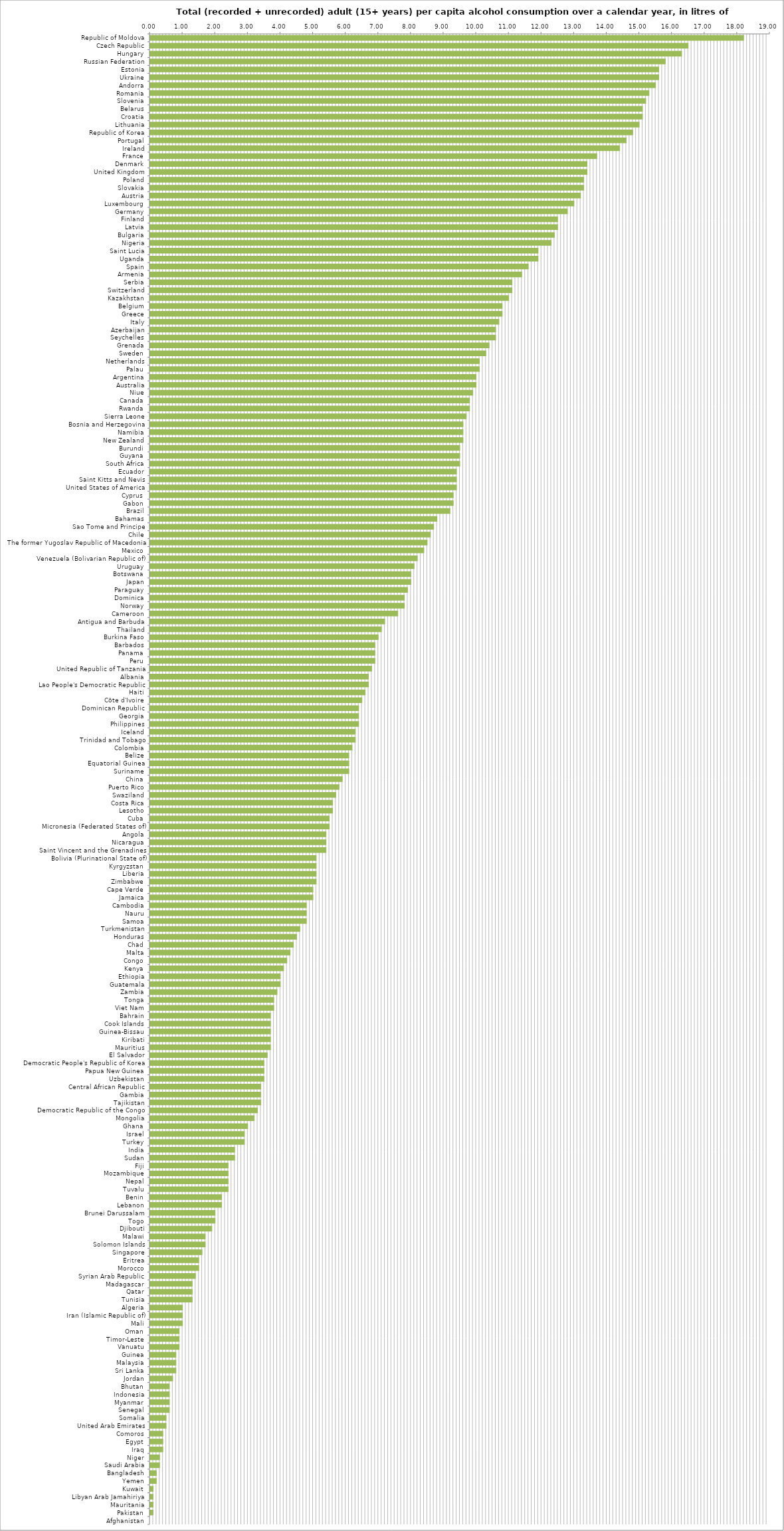
| Category | Series 0 |
|---|---|
| Republic of Moldova | 18.2 |
| Czech Republic | 16.5 |
| Hungary | 16.3 |
| Russian Federation | 15.8 |
| Estonia | 15.6 |
| Ukraine | 15.6 |
| Andorra | 15.5 |
| Romania | 15.3 |
| Slovenia | 15.2 |
| Belarus | 15.1 |
| Croatia | 15.1 |
| Lithuania | 15 |
| Republic of Korea | 14.8 |
| Portugal | 14.6 |
| Ireland | 14.4 |
| France | 13.7 |
| Denmark | 13.4 |
| United Kingdom | 13.4 |
| Poland | 13.3 |
| Slovakia | 13.3 |
| Austria | 13.2 |
| Luxembourg | 13 |
| Germany | 12.8 |
| Finland | 12.5 |
| Latvia | 12.5 |
| Bulgaria | 12.4 |
| Nigeria | 12.3 |
| Saint Lucia | 11.9 |
| Uganda | 11.9 |
| Spain | 11.6 |
| Armenia | 11.4 |
| Serbia | 11.1 |
| Switzerland | 11.1 |
| Kazakhstan | 11 |
| Belgium | 10.8 |
| Greece | 10.8 |
| Italy | 10.7 |
| Azerbaijan | 10.6 |
| Seychelles | 10.6 |
| Grenada | 10.4 |
| Sweden | 10.3 |
| Netherlands | 10.1 |
| Palau | 10.1 |
| Argentina | 10 |
| Australia | 10 |
| Niue | 9.9 |
| Canada | 9.8 |
| Rwanda | 9.8 |
| Sierra Leone | 9.7 |
| Bosnia and Herzegovina | 9.6 |
| Namibia | 9.6 |
| New Zealand | 9.6 |
| Burundi | 9.5 |
| Guyana | 9.5 |
| South Africa | 9.5 |
| Ecuador | 9.4 |
| Saint Kitts and Nevis | 9.4 |
| United States of America | 9.4 |
| Cyprus | 9.3 |
| Gabon | 9.3 |
| Brazil | 9.2 |
| Bahamas | 8.8 |
| Sao Tome and Principe | 8.7 |
| Chile | 8.6 |
| The former Yugoslav Republic of Macedonia | 8.5 |
| Mexico | 8.4 |
| Venezuela (Bolivarian Republic of) | 8.2 |
| Uruguay | 8.1 |
| Botswana | 8 |
| Japan | 8 |
| Paraguay | 7.9 |
| Dominica | 7.8 |
| Norway | 7.8 |
| Cameroon | 7.6 |
| Antigua and Barbuda | 7.2 |
| Thailand | 7.1 |
| Burkina Faso | 7 |
| Barbados | 6.9 |
| Panama | 6.9 |
| Peru | 6.9 |
| United Republic of Tanzania | 6.8 |
| Albania | 6.7 |
| Lao People's Democratic Republic | 6.7 |
| Haiti | 6.6 |
| Côte d'Ivoire | 6.5 |
| Dominican Republic | 6.4 |
| Georgia | 6.4 |
| Philippines | 6.4 |
| Iceland | 6.3 |
| Trinidad and Tobago | 6.3 |
| Colombia | 6.2 |
| Belize | 6.1 |
| Equatorial Guinea | 6.1 |
| Suriname | 6.1 |
| China | 5.9 |
| Puerto Rico | 5.8 |
| Swaziland | 5.7 |
| Costa Rica | 5.6 |
| Lesotho | 5.6 |
| Cuba | 5.5 |
| Micronesia (Federated States of) | 5.5 |
| Angola | 5.4 |
| Nicaragua | 5.4 |
| Saint Vincent and the Grenadines | 5.4 |
| Bolivia (Plurinational State of) | 5.1 |
| Kyrgyzstan | 5.1 |
| Liberia | 5.1 |
| Zimbabwe | 5.1 |
| Cape Verde | 5 |
| Jamaica | 5 |
| Cambodia | 4.8 |
| Nauru | 4.8 |
| Samoa | 4.8 |
| Turkmenistan | 4.6 |
| Honduras | 4.5 |
| Chad | 4.4 |
| Malta | 4.3 |
| Congo | 4.2 |
| Kenya | 4.1 |
| Ethiopia | 4 |
| Guatemala | 4 |
| Zambia | 3.9 |
| Tonga | 3.8 |
| Viet Nam | 3.8 |
| Bahrain | 3.7 |
| Cook Islands | 3.7 |
| Guinea-Bissau | 3.7 |
| Kiribati | 3.7 |
| Mauritius | 3.7 |
| El Salvador | 3.6 |
| Democratic People's Republic of Korea | 3.5 |
| Papua New Guinea | 3.5 |
| Uzbekistan | 3.5 |
| Central African Republic | 3.4 |
| Gambia | 3.4 |
| Tajikistan | 3.4 |
| Democratic Republic of the Congo | 3.3 |
| Mongolia | 3.2 |
| Ghana | 3 |
| Israel | 2.9 |
| Turkey | 2.9 |
| India | 2.6 |
| Sudan | 2.6 |
| Fiji | 2.4 |
| Mozambique | 2.4 |
| Nepal | 2.4 |
| Tuvalu | 2.4 |
| Benin | 2.2 |
| Lebanon | 2.2 |
| Brunei Darussalam | 2 |
| Togo | 2 |
| Djibouti | 1.9 |
| Malawi | 1.7 |
| Solomon Islands | 1.7 |
| Singapore | 1.6 |
| Eritrea | 1.5 |
| Morocco | 1.5 |
| Syrian Arab Republic | 1.4 |
| Madagascar | 1.3 |
| Qatar | 1.3 |
| Tunisia | 1.3 |
| Algeria | 1 |
| Iran (Islamic Republic of) | 1 |
| Mali | 1 |
| Oman | 0.9 |
| Timor-Leste | 0.9 |
| Vanuatu | 0.9 |
| Guinea | 0.8 |
| Malaysia | 0.8 |
| Sri Lanka | 0.8 |
| Jordan | 0.7 |
| Bhutan | 0.6 |
| Indonesia | 0.6 |
| Myanmar | 0.6 |
| Senegal | 0.6 |
| Somalia | 0.5 |
| United Arab Emirates | 0.5 |
| Comoros | 0.4 |
| Egypt | 0.4 |
| Iraq | 0.4 |
| Niger | 0.3 |
| Saudi Arabia | 0.3 |
| Bangladesh | 0.2 |
| Yemen | 0.2 |
| Kuwait | 0.1 |
| Libyan Arab Jamahiriya | 0.1 |
| Mauritania | 0.1 |
| Pakistan | 0.1 |
| Afghanistan | 0 |